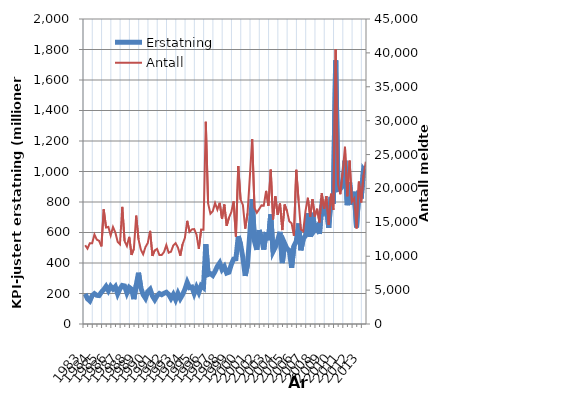
| Category | Erstatning |
|---|---|
| 1983.0 | 197.588 |
| nan | 165.511 |
| nan | 151.359 |
| nan | 185.41 |
| 1984.0 | 198.82 |
| nan | 188.069 |
| nan | 186.467 |
| nan | 208.564 |
| 1985.0 | 225.381 |
| nan | 246.348 |
| nan | 218.294 |
| nan | 247.574 |
| 1986.0 | 229.539 |
| nan | 245.617 |
| nan | 197.688 |
| nan | 231.341 |
| 1987.0 | 252.735 |
| nan | 249.403 |
| nan | 204.097 |
| nan | 240.126 |
| 1988.0 | 228.552 |
| nan | 162.922 |
| nan | 253.756 |
| nan | 336.155 |
| 1989.0 | 237.486 |
| nan | 191.945 |
| nan | 168.896 |
| nan | 213.081 |
| 1990.0 | 228.154 |
| nan | 183.55 |
| nan | 159.187 |
| nan | 185.288 |
| 1991.0 | 199.943 |
| nan | 192.245 |
| nan | 201.197 |
| nan | 208.012 |
| 1992.0 | 194.322 |
| nan | 167.439 |
| nan | 193.471 |
| nan | 159.652 |
| 1993.0 | 200.319 |
| nan | 166.71 |
| nan | 192.604 |
| nan | 227.856 |
| 1994.0 | 272.908 |
| nan | 238.583 |
| nan | 242.398 |
| nan | 199.796 |
| 1995.0 | 240.712 |
| nan | 207.084 |
| nan | 251.629 |
| nan | 238.909 |
| 1996.0 | 523.926 |
| nan | 324.424 |
| nan | 330.22 |
| nan | 318.471 |
| 1997.0 | 344.773 |
| nan | 378.33 |
| nan | 400.656 |
| nan | 357.477 |
| 1998.0 | 377.13 |
| nan | 334.101 |
| nan | 339.56 |
| nan | 390.285 |
| 1999.0 | 425.689 |
| nan | 427.757 |
| nan | 575.602 |
| nan | 521.283 |
| 2000.0 | 434.524 |
| nan | 315.56 |
| nan | 391.205 |
| nan | 596.467 |
| 2001.0 | 818.583 |
| nan | 541.905 |
| nan | 486.703 |
| nan | 615.779 |
| 2002.0 | 560.824 |
| nan | 487.972 |
| nan | 603.049 |
| nan | 549.512 |
| 2003.0 | 718.687 |
| nan | 475.17 |
| nan | 505.52 |
| nan | 550.69 |
| 2004.0 | 604.137 |
| nan | 399.414 |
| nan | 528.042 |
| nan | 493.557 |
| 2005.0 | 483.071 |
| nan | 368.65 |
| nan | 511.786 |
| nan | 542.365 |
| 2006.0 | 659.254 |
| nan | 483.472 |
| nan | 556.294 |
| nan | 580.368 |
| 2007.0 | 726.446 |
| nan | 571.14 |
| nan | 729.727 |
| nan | 616.971 |
| 2008.0 | 638.028 |
| nan | 590.654 |
| nan | 771.428 |
| nan | 740.877 |
| 2009.0 | 777.468 |
| nan | 631.18 |
| nan | 833.772 |
| nan | 788.089 |
| 2010.0 | 1728.747 |
| nan | 881.747 |
| nan | 885.989 |
| nan | 906.404 |
| 2011.0 | 1071.204 |
| nan | 778.954 |
| nan | 928.783 |
| nan | 782.745 |
| 2012.0 | 867.175 |
| nan | 633.984 |
| nan | 874.087 |
| nan | 823.035 |
| 2013.0 | 1010.773 |
| nan | 989.738 |